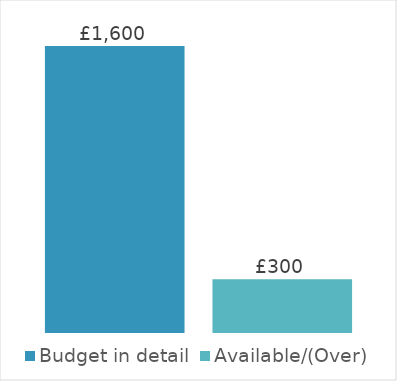
| Category | Budget in detail | Available/(Over) |
|---|---|---|
| 0 | 1600 | 300 |